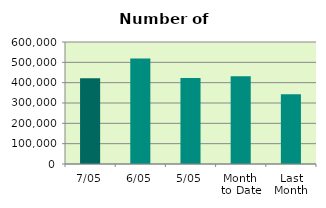
| Category | Series 0 |
|---|---|
| 7/05 | 422266 |
| 6/05 | 518788 |
| 5/05 | 423232 |
| Month 
to Date | 431707.2 |
| Last
Month | 343067.2 |